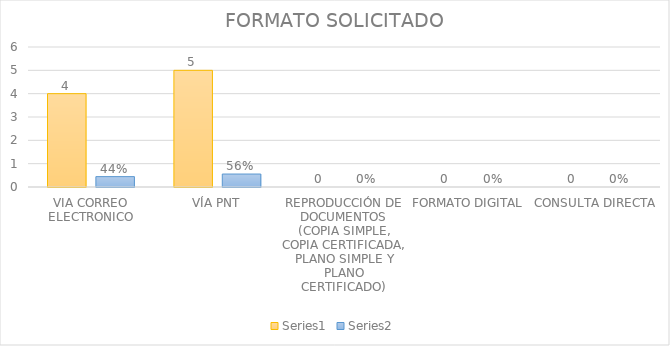
| Category | Series 3 | Series 4 |
|---|---|---|
| VIA CORREO ELECTRONICO | 4 | 0.444 |
| VÍA PNT | 5 | 0.556 |
| REPRODUCCIÓN DE DOCUMENTOS (COPIA SIMPLE, COPIA CERTIFICADA, PLANO SIMPLE Y PLANO CERTIFICADO) | 0 | 0 |
| FORMATO DIGITAL | 0 | 0 |
| CONSULTA DIRECTA | 0 | 0 |